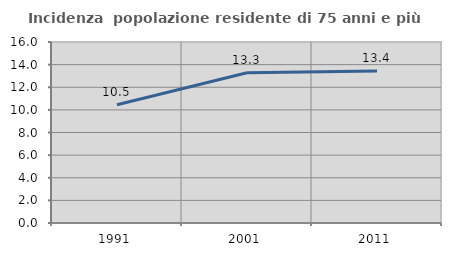
| Category | Incidenza  popolazione residente di 75 anni e più |
|---|---|
| 1991.0 | 10.458 |
| 2001.0 | 13.278 |
| 2011.0 | 13.446 |